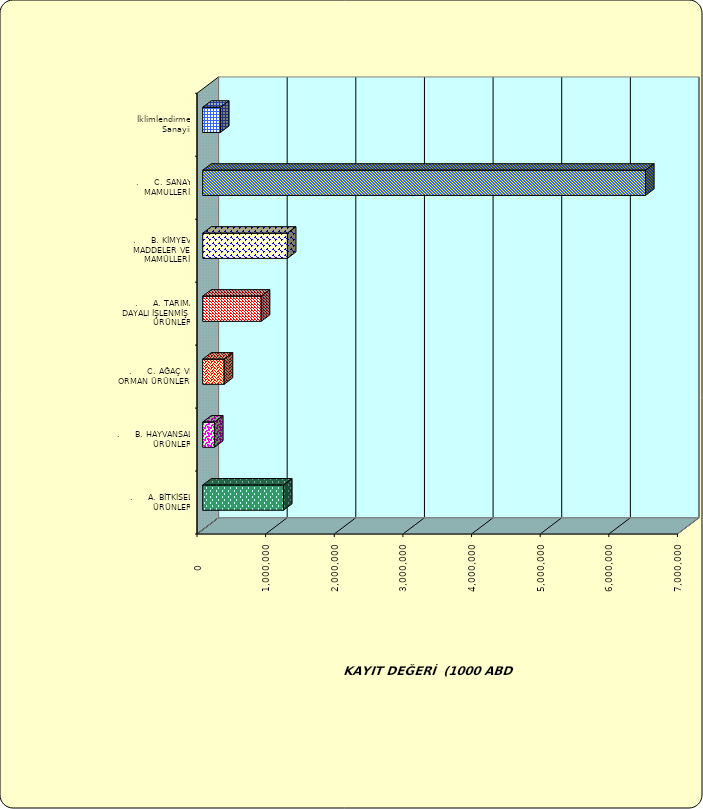
| Category | Series 0 |
|---|---|
| .     A. BİTKİSEL ÜRÜNLER | 1176582.131 |
| .     B. HAYVANSAL ÜRÜNLER | 171675.016 |
| .     C. AĞAÇ VE ORMAN ÜRÜNLERİ | 312958.827 |
| .     A. TARIMA DAYALI İŞLENMİŞ ÜRÜNLER | 852908.095 |
| .     B. KİMYEVİ MADDELER VE MAMÜLLERİ | 1233868.473 |
| .     C. SANAYİ MAMULLERİ | 6451334.07 |
|  İklimlendirme Sanayii | 258522.519 |